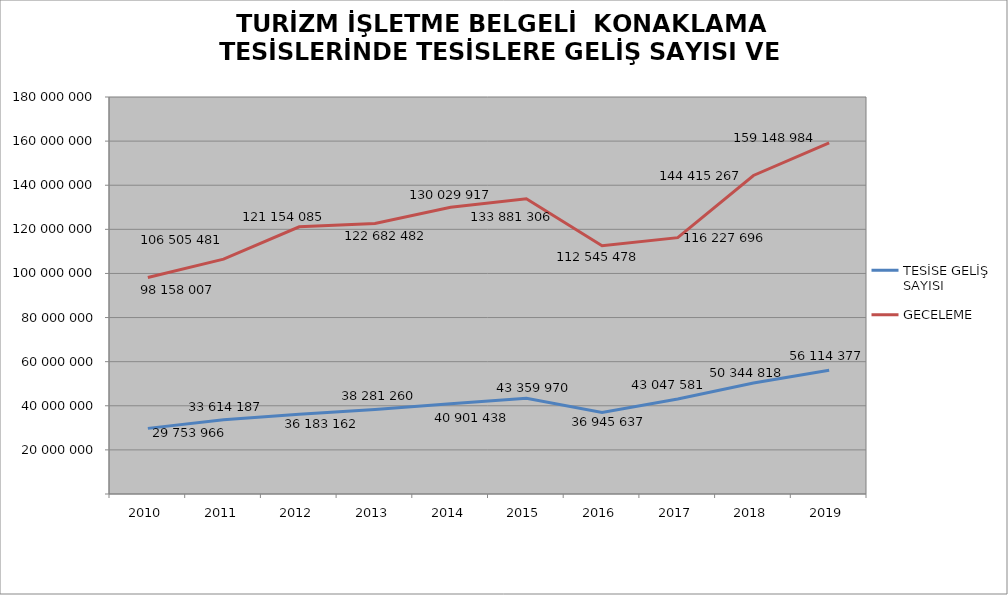
| Category | TESİSE GELİŞ SAYISI | GECELEME |
|---|---|---|
| 2010 | 29753966 | 98158007 |
| 2011 | 33614187 | 106505481 |
| 2012 | 36183162 | 121154085 |
| 2013 | 38281260 | 122682482 |
| 2014 | 40901438 | 130029917 |
| 2015 | 43359970 | 133881306 |
| 2016 | 36945637 | 112545478 |
| 2017 | 43047581 | 116227696 |
| 2018 | 50344818 | 144415267 |
| 2019 | 56114377 | 159148984 |